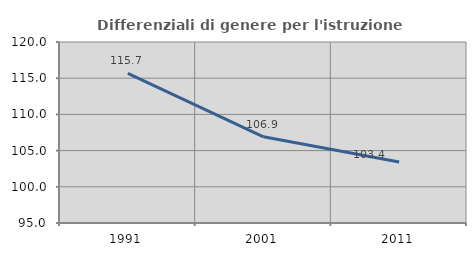
| Category | Differenziali di genere per l'istruzione superiore |
|---|---|
| 1991.0 | 115.677 |
| 2001.0 | 106.902 |
| 2011.0 | 103.432 |